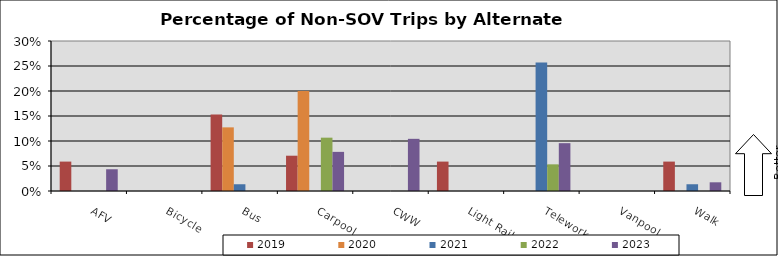
| Category | 2019 | 2020 | 2021 | 2022 | 2023 |
|---|---|---|---|---|---|
| AFV | 0.059 | 0 | 0 | 0 | 0.043 |
| Bicycle | 0 | 0 | 0 | 0 | 0 |
| Bus | 0.153 | 0.127 | 0.014 | 0 | 0 |
| Carpool | 0.071 | 0.2 | 0 | 0.107 | 0.078 |
| CWW | 0 | 0 | 0 | 0 | 0.104 |
| Light Rail | 0.059 | 0 | 0 | 0 | 0 |
| Telework | 0 | 0 | 0.257 | 0.053 | 0.096 |
| Vanpool | 0 | 0 | 0 | 0 | 0 |
| Walk | 0.059 | 0 | 0.014 | 0 | 0.017 |